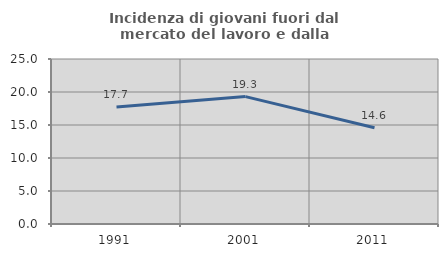
| Category | Incidenza di giovani fuori dal mercato del lavoro e dalla formazione  |
|---|---|
| 1991.0 | 17.732 |
| 2001.0 | 19.304 |
| 2011.0 | 14.583 |